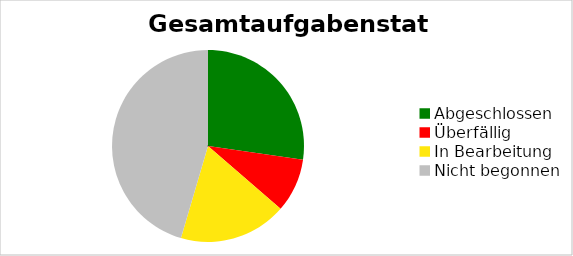
| Category | Series 0 |
|---|---|
| Abgeschlossen | 0.273 |
| Überfällig | 0.091 |
| In Bearbeitung | 0.182 |
| Nicht begonnen | 0.455 |